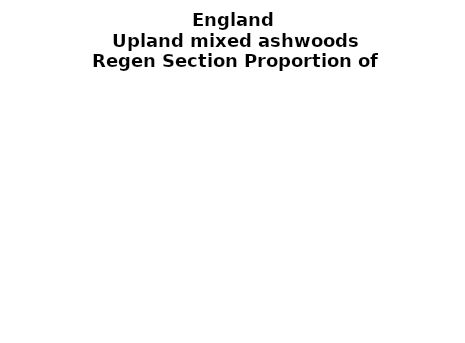
| Category | Upland mixed ashwoods |
|---|---|
| None | 0.061 |
| Seedlings only | 0 |
| Seedlings, saplings only | 0.041 |
| Seedlings, saplings, <7 cm trees | 0.259 |
| Saplings only | 0.157 |
| <7 cm trees, seedlings only | 0 |
| <7 cm trees, saplings only | 0.43 |
| <7 cm Trees only | 0.051 |